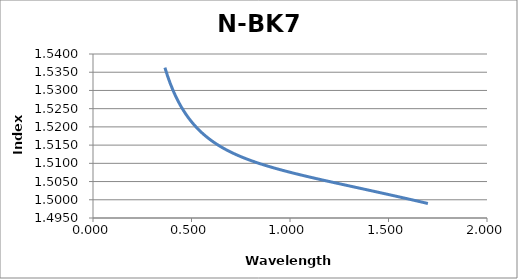
| Category | N-BK7 |
|---|---|
| 0.365 | 1.536 |
| 0.3784848 | 1.534 |
| 0.3919697 | 1.532 |
| 0.4054545 | 1.53 |
| 0.4189394 | 1.528 |
| 0.4324242 | 1.527 |
| 0.4459091 | 1.526 |
| 0.4593939 | 1.524 |
| 0.4728788 | 1.523 |
| 0.4863636 | 1.522 |
| 0.4998485 | 1.521 |
| 0.5133333 | 1.521 |
| 0.5268182 | 1.52 |
| 0.540303 | 1.519 |
| 0.5537879 | 1.518 |
| 0.5672727 | 1.518 |
| 0.5807576 | 1.517 |
| 0.5942424 | 1.517 |
| 0.6077273 | 1.516 |
| 0.6212121 | 1.515 |
| 0.634697 | 1.515 |
| 0.6481818 | 1.515 |
| 0.6616667 | 1.514 |
| 0.6751515 | 1.514 |
| 0.6886364 | 1.513 |
| 0.7021212 | 1.513 |
| 0.7156061 | 1.513 |
| 0.7290909 | 1.512 |
| 0.7425758 | 1.512 |
| 0.7560606 | 1.512 |
| 0.7695455 | 1.511 |
| 0.7830303 | 1.511 |
| 0.7965152 | 1.511 |
| 0.81 | 1.511 |
| 0.8234848 | 1.51 |
| 0.8369697 | 1.51 |
| 0.8504545 | 1.51 |
| 0.8639394 | 1.51 |
| 0.8774242 | 1.509 |
| 0.8909091 | 1.509 |
| 0.9043939 | 1.509 |
| 0.9178788 | 1.509 |
| 0.9313636 | 1.509 |
| 0.9448485 | 1.508 |
| 0.9583333 | 1.508 |
| 0.9718182 | 1.508 |
| 0.985303 | 1.508 |
| 0.9987879 | 1.508 |
| 1.012273 | 1.507 |
| 1.025758 | 1.507 |
| 1.039242 | 1.507 |
| 1.052727 | 1.507 |
| 1.066212 | 1.507 |
| 1.079697 | 1.506 |
| 1.093182 | 1.506 |
| 1.106667 | 1.506 |
| 1.120152 | 1.506 |
| 1.133636 | 1.506 |
| 1.147121 | 1.506 |
| 1.160606 | 1.505 |
| 1.174091 | 1.505 |
| 1.187576 | 1.505 |
| 1.201061 | 1.505 |
| 1.214545 | 1.505 |
| 1.22803 | 1.505 |
| 1.241515 | 1.505 |
| 1.255 | 1.504 |
| 1.268485 | 1.504 |
| 1.28197 | 1.504 |
| 1.295455 | 1.504 |
| 1.308939 | 1.504 |
| 1.322424 | 1.504 |
| 1.335909 | 1.503 |
| 1.349394 | 1.503 |
| 1.362879 | 1.503 |
| 1.376364 | 1.503 |
| 1.389848 | 1.503 |
| 1.403333 | 1.503 |
| 1.416818 | 1.502 |
| 1.430303 | 1.502 |
| 1.443788 | 1.502 |
| 1.457273 | 1.502 |
| 1.470758 | 1.502 |
| 1.484242 | 1.502 |
| 1.497727 | 1.501 |
| 1.511212 | 1.501 |
| 1.524697 | 1.501 |
| 1.538182 | 1.501 |
| 1.551667 | 1.501 |
| 1.565152 | 1.501 |
| 1.578636 | 1.5 |
| 1.592121 | 1.5 |
| 1.605606 | 1.5 |
| 1.619091 | 1.5 |
| 1.632576 | 1.5 |
| 1.646061 | 1.5 |
| 1.659545 | 1.499 |
| 1.67303 | 1.499 |
| 1.686515 | 1.499 |
| 1.7 | 1.499 |